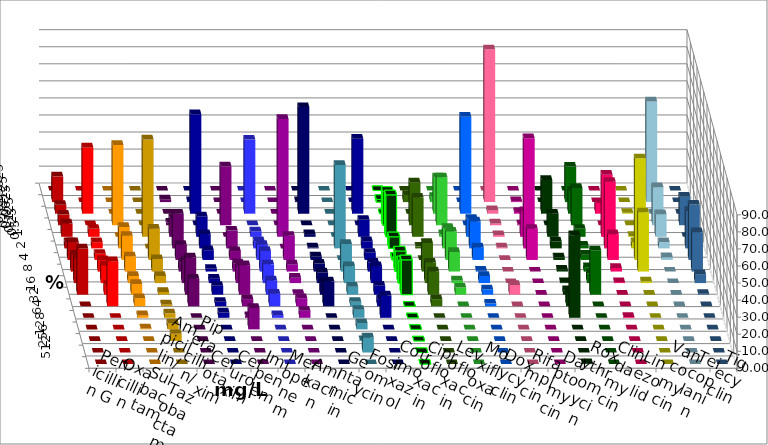
| Category | Penicillin G | Oxacillin | Ampicillin/ Sulbactam | Piperacillin/ Tazobactam | Cefotaxim | Cefuroxim | Imipenem | Meropenem | Amikacin | Gentamicin | Fosfomycin | Cotrimoxazol | Ciprofloxacin | Levofloxacin | Moxifloxacin | Doxycyclin | Rifampicin | Daptomycin | Roxythromycin | Clindamycin | Linezolid | Vancomycin | Teicoplanin | Tigecyclin |
|---|---|---|---|---|---|---|---|---|---|---|---|---|---|---|---|---|---|---|---|---|---|---|---|---|
| 0.015625 | 0 | 0 | 0 | 0 | 0 | 0 | 0 | 0 | 0 | 0 | 0 | 0 | 0 | 0 | 0 | 0 | 0 | 0 | 0 | 0 | 0 | 0 | 0 | 0 |
| 0.03125 | 15.104 | 0 | 0 | 0 | 1.562 | 0 | 0.521 | 0 | 0 | 0.521 | 0 | 0 | 1.571 | 4.188 | 3.125 | 0 | 89.583 | 0.521 | 0 | 20.833 | 0 | 0 | 0 | 59.043 |
| 0.0625 | 5.208 | 38.86 | 0 | 0 | 0 | 0 | 58.333 | 43.455 | 0 | 62.5 | 0 | 43.979 | 0 | 0 | 21.354 | 56.842 | 2.083 | 1.042 | 19.792 | 13.542 | 6.25 | 0.518 | 0 | 0 |
| 0.125 | 6.25 | 0 | 47.12 | 0 | 1.562 | 34.555 | 0 | 0 | 0 | 0 | 0 | 0 | 19.895 | 25.131 | 28.125 | 0 | 1.042 | 0.521 | 0 | 21.875 | 0 | 0 | 16.754 | 22.34 |
| 0.25 | 7.812 | 4.663 | 0 | 57.068 | 10.938 | 0 | 11.979 | 3.141 | 69.11 | 1.562 | 0 | 9.948 | 24.607 | 23.037 | 1.562 | 10.526 | 1.042 | 15.104 | 13.542 | 4.688 | 36.458 | 0.518 | 0 | 13.298 |
| 0.5 | 3.646 | 3.627 | 12.565 | 0 | 20.312 | 10.471 | 8.333 | 4.188 | 0 | 0.521 | 48.958 | 4.188 | 6.806 | 1.047 | 11.979 | 15.789 | 0.521 | 64.583 | 4.167 | 1.562 | 39.062 | 3.627 | 21.99 | 3.723 |
| 1.0 | 10.417 | 3.627 | 14.136 | 18.325 | 8.854 | 5.236 | 5.729 | 8.901 | 14.136 | 2.083 | 0 | 4.188 | 1.571 | 0 | 16.667 | 7.368 | 0 | 18.229 | 1.562 | 3.125 | 15.104 | 59.585 | 32.461 | 1.596 |
| 2.0 | 9.896 | 6.736 | 8.901 | 7.33 | 5.208 | 4.712 | 1.562 | 12.042 | 4.188 | 4.688 | 16.146 | 5.236 | 12.042 | 16.754 | 11.458 | 0.526 | 0 | 0 | 1.042 | 2.604 | 2.083 | 34.715 | 23.037 | 0 |
| 4.0 | 14.583 | 10.363 | 4.188 | 4.188 | 13.542 | 9.948 | 2.604 | 10.995 | 3.141 | 6.25 | 9.896 | 9.948 | 13.089 | 12.042 | 1.562 | 4.211 | 0 | 0 | 0.521 | 5.729 | 0.521 | 1.036 | 5.236 | 0 |
| 8.0 | 27.083 | 5.699 | 6.283 | 1.571 | 21.875 | 17.277 | 5.208 | 8.377 | 0.524 | 7.292 | 4.688 | 5.236 | 20.419 | 13.613 | 4.167 | 3.158 | 5.729 | 0 | 2.604 | 26.042 | 0 | 0 | 0.524 | 0 |
| 16.0 | 0 | 26.425 | 4.712 | 1.047 | 16.146 | 4.188 | 2.604 | 7.33 | 4.712 | 14.583 | 2.604 | 4.188 | 0 | 4.188 | 0 | 1.579 | 0 | 0 | 7.812 | 0 | 0 | 0 | 0 | 0 |
| 32.0 | 0 | 0 | 1.571 | 2.618 | 0 | 1.047 | 3.125 | 1.571 | 4.188 | 0 | 4.688 | 13.089 | 0 | 0 | 0 | 0 | 0 | 0 | 48.438 | 0 | 0.521 | 0 | 0 | 0 |
| 64.0 | 0 | 0 | 0.524 | 3.665 | 0 | 12.565 | 0 | 0 | 0 | 0 | 3.646 | 0 | 0 | 0 | 0 | 0 | 0 | 0 | 0 | 0 | 0 | 0 | 0 | 0 |
| 128.0 | 0 | 0 | 0 | 4.188 | 0 | 0 | 0 | 0 | 0 | 0 | 0.521 | 0 | 0 | 0 | 0 | 0 | 0 | 0 | 0 | 0 | 0 | 0 | 0 | 0 |
| 256.0 | 0 | 0 | 0 | 0 | 0 | 0 | 0 | 0 | 0 | 0 | 8.854 | 0 | 0 | 0 | 0 | 0 | 0 | 0 | 0 | 0 | 0 | 0 | 0 | 0 |
| 512.0 | 0 | 0 | 0 | 0 | 0 | 0 | 0 | 0 | 0 | 0 | 0 | 0 | 0 | 0 | 0 | 0 | 0 | 0 | 0.521 | 0 | 0 | 0 | 0 | 0 |